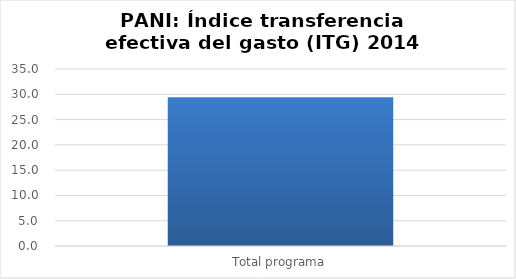
| Category | Índice transferencia efectiva del gasto (ITG) |
|---|---|
| Total programa | 29.438 |